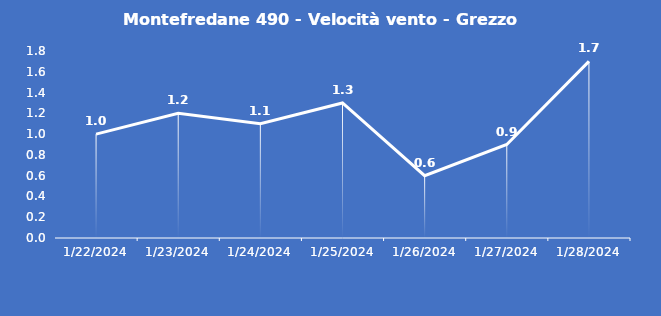
| Category | Montefredane 490 - Velocità vento - Grezzo (m/s) |
|---|---|
| 1/22/24 | 1 |
| 1/23/24 | 1.2 |
| 1/24/24 | 1.1 |
| 1/25/24 | 1.3 |
| 1/26/24 | 0.6 |
| 1/27/24 | 0.9 |
| 1/28/24 | 1.7 |